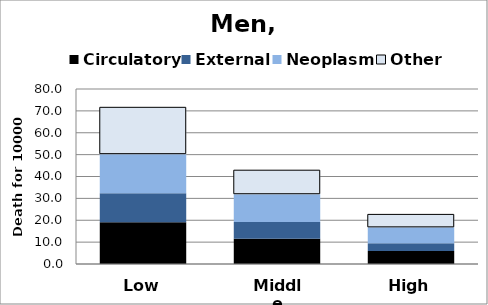
| Category | Circulatory | External | Neoplasm | Other |
|---|---|---|---|---|
| Low | 19.077 | 13.312 | 17.823 | 21.412 |
| Middle | 11.537 | 7.706 | 12.652 | 10.988 |
| High | 5.897 | 3.633 | 7.224 | 5.919 |